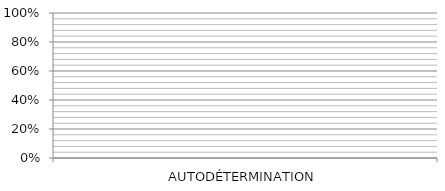
| Category | Series 0 | Series 1 | Series 2 | Series 3 | Series 4 | Series 5 | Series 6 | Series 7 |
|---|---|---|---|---|---|---|---|---|
| AUTODÉTERMINATION | 0 | 0 | 0 | 0 | 0 | 0 | 0 | 0 |